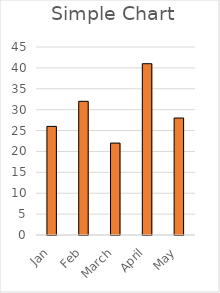
| Category | Series 0 |
|---|---|
| Jan | 26 |
| Feb | 32 |
| March | 22 |
| April | 41 |
| May | 28 |